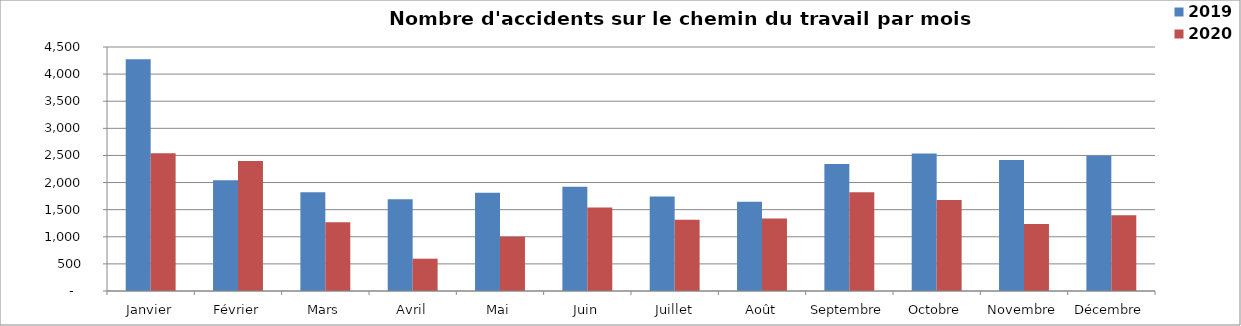
| Category | 2019 | 2020 |
|---|---|---|
| Janvier | 4275 | 2539 |
| Février | 2044 | 2398 |
| Mars | 1822 | 1268 |
| Avril | 1692 | 596 |
| Mai | 1810 | 999 |
| Juin | 1922 | 1541 |
| Juillet | 1741 | 1315 |
| Août | 1647 | 1339 |
| Septembre | 2341 | 1819 |
| Octobre | 2537 | 1679 |
| Novembre | 2414 | 1236 |
| Décembre | 2495 | 1397 |